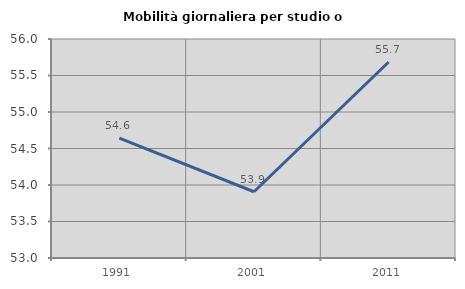
| Category | Mobilità giornaliera per studio o lavoro |
|---|---|
| 1991.0 | 54.642 |
| 2001.0 | 53.907 |
| 2011.0 | 55.685 |